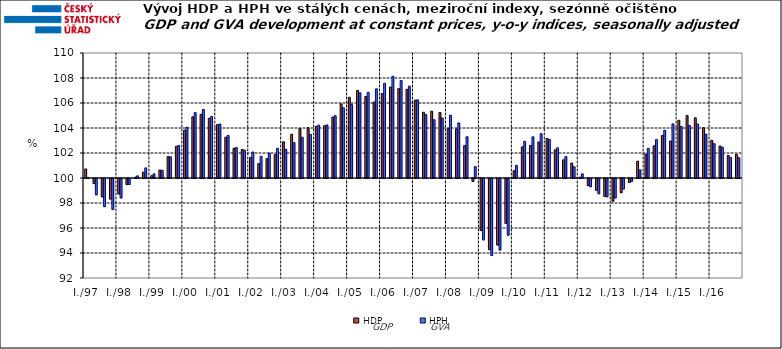
| Category | HDP

 | HPH

 |
|---|---|---|
| I./97 | 100.724 | 100.023 |
|  | 99.593 | 98.696 |
|  | 98.534 | 97.75 |
|  | 98.353 | 97.524 |
| I./98 | 98.764 | 98.448 |
|  | 99.514 | 99.521 |
|  | 100.062 | 100.171 |
|  | 100.468 | 100.809 |
| I./99 | 100.184 | 100.328 |
|  | 100.635 | 100.615 |
|  | 101.718 | 101.7 |
|  | 102.536 | 102.597 |
| I./00 | 103.823 | 104.066 |
|  | 104.898 | 105.228 |
|  | 105.09 | 105.478 |
|  | 104.778 | 104.915 |
| I./01 | 104.275 | 104.318 |
|  | 103.265 | 103.409 |
|  | 102.378 | 102.435 |
|  | 102.281 | 102.231 |
| I./02 | 101.633 | 102.082 |
|  | 101.154 | 101.735 |
|  | 101.558 | 101.989 |
|  | 101.886 | 102.375 |
| I./03 | 102.895 | 102.3 |
|  | 103.502 | 102.829 |
|  | 103.968 | 103.261 |
|  | 104.025 | 103.493 |
| I./04 | 104.133 | 104.228 |
|  | 104.183 | 104.242 |
|  | 104.877 | 104.987 |
|  | 105.93 | 105.616 |
| I./05 | 106.458 | 105.874 |
|  | 107.01 | 106.814 |
|  | 106.532 | 106.856 |
|  | 106.074 | 107.133 |
| I./06 | 106.757 | 107.582 |
|  | 107.281 | 108.134 |
|  | 107.154 | 107.801 |
|  | 107.09 | 107.348 |
| I./07 | 106.231 | 106.255 |
|  | 105.261 | 105.069 |
|  | 105.344 | 104.662 |
|  | 105.24 | 104.803 |
| I./08 | 103.952 | 105.025 |
|  | 103.919 | 104.404 |
|  | 102.591 | 103.301 |
|  | 99.763 | 100.917 |
| I./09 | 95.837 | 95.089 |
|  | 94.311 | 93.843 |
|  | 94.679 | 94.279 |
|  | 96.412 | 95.47 |
| I./10 | 100.58 | 101.003 |
|  | 102.485 | 102.933 |
|  | 102.607 | 103.294 |
|  | 102.876 | 103.545 |
| I./11 | 103.166 | 103.084 |
|  | 102.251 | 102.416 |
|  | 101.45 | 101.709 |
|  | 101.196 | 100.898 |
| I./12 | 100.062 | 100.329 |
|  | 99.434 | 99.341 |
|  | 99.06 | 98.779 |
|  | 98.564 | 98.536 |
| I./13 | 98.182 | 98.444 |
|  | 98.865 | 99.164 |
|  | 99.681 | 99.781 |
|  | 101.344 | 100.651 |
| I./14 | 101.912 | 102.372 |
|  | 102.57 | 103.077 |
|  | 103.409 | 103.816 |
|  | 102.96 | 104.328 |
| I./15 | 104.618 | 104.117 |
|  | 105.004 | 104.204 |
|  | 104.815 | 104.321 |
|  | 104.027 | 103.51 |
| I./16 | 103.012 | 102.74 |